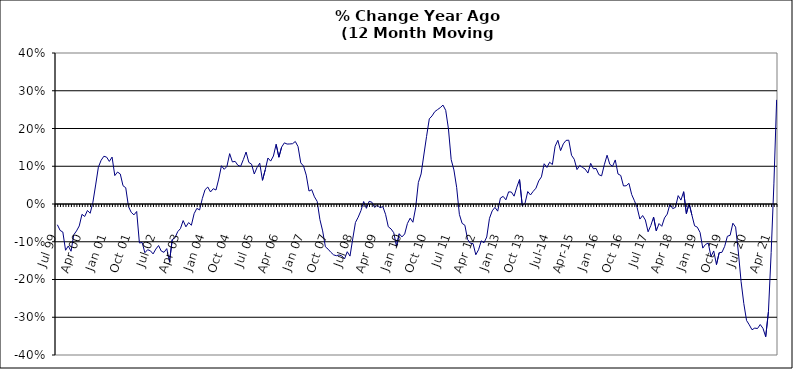
| Category | Series 0 |
|---|---|
| Jul 99 | -0.055 |
| Aug 99 | -0.07 |
| Sep 99 | -0.074 |
| Oct 99 | -0.123 |
| Nov 99 | -0.111 |
| Dec 99 | -0.125 |
| Jan 00 | -0.082 |
| Feb 00 | -0.071 |
| Mar 00 | -0.058 |
| Apr 00 | -0.027 |
| May 00 | -0.033 |
| Jun 00 | -0.017 |
| Jul 00 | -0.025 |
| Aug 00 | 0.005 |
| Sep 00 | 0.05 |
| Oct 00 | 0.098 |
| Nov 00 | 0.116 |
| Dec 00 | 0.127 |
| Jan 01 | 0.124 |
| Feb 01 | 0.113 |
| Mar 01 | 0.124 |
| Apr 01 | 0.075 |
| May 01 | 0.085 |
| Jun 01 | 0.08 |
| Jul 01 | 0.048 |
| Aug 01 | 0.043 |
| Sep 01 | -0.007 |
| Oct 01 | -0.022 |
| Nov 01 | -0.029 |
| Dec 01 | -0.02 |
| Jan 02 | -0.103 |
| Feb 02 | -0.102 |
| Mar 02 | -0.129 |
| Apr 02 | -0.121 |
| May 02 | -0.124 |
| Jun 02 | -0.132 |
| Jul 02 | -0.119 |
| Aug 02 | -0.11 |
| Sep 02 | -0.125 |
| Oct 02 | -0.128 |
| Nov 02 | -0.118 |
| Dec 02 | -0.153 |
| Jan 03 | -0.094 |
| Feb 03 | -0.09 |
| Mar 03 | -0.073 |
| Apr 03 | -0.065 |
| May 03 | -0.044 |
| Jun 03 | -0.06 |
| Jul 03 | -0.049 |
| Aug 03 | -0.056 |
| Sep 03 | -0.026 |
| Oct 03 | -0.012 |
| Nov 03 | -0.016 |
| Dec 03 | 0.014 |
| Jan 04 | 0.038 |
| Feb 04 | 0.045 |
| Mar 04 | 0.032 |
| Apr 04 | 0.041 |
| May 04 | 0.037 |
| Jun 04 | 0.066 |
| Jul 04 | 0.101 |
| Aug 04 | 0.092 |
| Sep 04 | 0.1 |
| Oct 04 | 0.133 |
| Nov 04 | 0.111 |
| Dec 04 | 0.113 |
| Jan 05 | 0.103 |
| Feb 05 | 0.1 |
| Mar 05 | 0.118 |
| Apr 05 | 0.138 |
| May 05 | 0.11 |
| Jun 05 | 0.106 |
| Jul 05 | 0.079 |
| Aug 05 | 0.097 |
| Sep 05 | 0.108 |
| Oct 05 | 0.063 |
| Nov 05 | 0.09 |
| Dec 05 | 0.122 |
| Jan 06 | 0.114 |
| Feb 06 | 0.127 |
| Mar 06 | 0.158 |
| Apr 06 | 0.124 |
| May 06 | 0.151 |
| Jun 06 | 0.162 |
| Jul 06 | 0.159 |
| Aug 06 | 0.159 |
| Sep 06 | 0.16 |
| Oct 06 | 0.166 |
| Nov 06 | 0.152 |
| Dec 06 | 0.109 |
| Jan 07 | 0.101 |
| Feb 07 | 0.076 |
| Mar 07 | 0.034 |
| Apr 07 | 0.038 |
| May 07 | 0.019 |
| Jun 07 | 0.007 |
| Jul 07 | -0.041 |
| Aug 07 | -0.071 |
| Sep 07 | -0.113 |
| Oct 07 | -0.12 |
| Nov 07 | -0.128 |
| Dec 07 | -0.135 |
| Jan 08 | -0.137 |
| Feb 08 | -0.135 |
| Mar 08 | -0.137 |
| Apr 08 | -0.145 |
| May 08 | -0.126 |
| Jun 08 | -0.138 |
| Jul 08 | -0.093 |
| Aug 08 | -0.049 |
| Sep-08 | -0.035 |
| Oct 08 | -0.018 |
| Nov 08 | 0.007 |
| Dec 08 | -0.011 |
| Jan 09 | 0.007 |
| Feb 09 | 0.005 |
| Mar 09 | -0.009 |
| Apr 09 | -0.003 |
| May 09 | -0.01 |
| Jun 09 | -0.007 |
| Jul 09 | -0.027 |
| Aug 09 | -0.06 |
| Sep 09 | -0.066 |
| Oct 09 | -0.076 |
| Nov 09 | -0.112 |
| Dec 09 | -0.079 |
| Jan 10 | -0.087 |
| Feb 10 | -0.079 |
| Mar 10 | -0.052 |
| Apr 10 | -0.037 |
| May 10 | -0.048 |
| Jun 10 | -0.01 |
| Jul 10 | 0.057 |
| Aug 10 | 0.08 |
| Sep 10 | 0.13 |
| Oct 10 | 0.179 |
| Nov 10 | 0.226 |
| Dec 10 | 0.233 |
| Jan 11 | 0.245 |
| Feb 11 | 0.25 |
| Mar 11 | 0.255 |
| Apr 11 | 0.262 |
| May 11 | 0.248 |
| Jun 11 | 0.199 |
| Jul 11 | 0.118 |
| Aug 11 | 0.09 |
| Sep 11 | 0.044 |
| Oct 11 | -0.028 |
| Nov 11 | -0.051 |
| Dec 11 | -0.056 |
| Jan 12 | -0.094 |
| Feb 12 | -0.104 |
| Mar 12 | -0.105 |
| Apr 12 | -0.134 |
| May 12 | -0.121 |
| Jun 12 | -0.098 |
| Jul 12 | -0.103 |
| Aug 12 | -0.087 |
| Sep 12 | -0.038 |
| Oct 12 | -0.018 |
| Nov 12 | -0.009 |
| Dec 12 | -0.019 |
| Jan 13 | 0.016 |
| Feb-13 | 0.02 |
| Mar-13 | 0.011 |
| Apr 13 | 0.032 |
| May 13 | 0.032 |
| Jun-13 | 0.021 |
| Jul 13 | 0.045 |
| Aug 13 | 0.065 |
| Sep 13 | -0.005 |
| Oct 13 | 0.002 |
| Nov 13 | 0.033 |
| Dec 13 | 0.024 |
| Jan 14 | 0.034 |
| Feb-14 | 0.042 |
| Mar 14 | 0.061 |
| Apr 14 | 0.072 |
| May 14 | 0.107 |
| Jun 14 | 0.097 |
| Jul-14 | 0.111 |
| Aug-14 | 0.105 |
| Sep 14 | 0.153 |
| Oct 14 | 0.169 |
| Nov 14 | 0.141 |
| Dec 14 | 0.159 |
| Jan 15 | 0.169 |
| Feb 15 | 0.169 |
| Mar 15 | 0.129 |
| Apr-15 | 0.118 |
| May 15 | 0.091 |
| Jun-15 | 0.102 |
| Jul 15 | 0.097 |
| Aug 15 | 0.092 |
| Sep 15 | 0.082 |
| Oct 15 | 0.108 |
| Nov 15 | 0.093 |
| Dec 15 | 0.094 |
| Jan 16 | 0.078 |
| Feb 16 | 0.075 |
| Mar 16 | 0.104 |
| Apr 16 | 0.129 |
| May 16 | 0.105 |
| Jun 16 | 0.1 |
| Jul 16 | 0.117 |
| Aug 16 | 0.08 |
| Sep 16 | 0.076 |
| Oct 16 | 0.048 |
| Nov 16 | 0.048 |
| Dec 16 | 0.055 |
| Jan 17 | 0.025 |
| Feb 17 | 0.009 |
| Mar 17 | -0.01 |
| Apr 17 | -0.04 |
| May 17 | -0.031 |
| Jun 17 | -0.042 |
| Jul 17 | -0.074 |
| Aug 17 | -0.057 |
| Sep 17 | -0.035 |
| Oct 17 | -0.071 |
| Nov 17 | -0.052 |
| Dec 17 | -0.059 |
| Jan 18 | -0.037 |
| Feb 18 | -0.027 |
| Mar 18 | 0 |
| Apr 18 | -0.012 |
| May 18 | -0.009 |
| Jun 18 | 0.022 |
| Jul 18 | 0.01 |
| Aug 18 | 0.033 |
| Sep 18 | -0.025 |
| Oct 18 | 0.002 |
| Nov 18 | -0.029 |
| Dec 18 | -0.058 |
| Jan 19 | -0.061 |
| Feb 19 | -0.075 |
| Mar 19 | -0.117 |
| Apr 19 | -0.107 |
| May 19 | -0.104 |
| Jun 19 | -0.139 |
| Jul 19 | -0.124 |
| Aug 19 | -0.16 |
| Sep 19 | -0.129 |
| Oct 19 | -0.128 |
| Nov 19 | -0.112 |
| Dec 19 | -0.085 |
| Jan 20 | -0.083 |
| Feb 20 | -0.051 |
| Mar 20 | -0.061 |
| Apr 20 | -0.127 |
| May 20 | -0.206 |
| Jun 20 | -0.264 |
| Jul 20 | -0.308 |
| Aug 20 | -0.32 |
| Sep 20 | -0.333 |
| Oct 20 | -0.329 |
| Nov 20 | -0.33 |
| Dec 20 | -0.319 |
| Jan 21 | -0.329 |
| Feb 21 | -0.352 |
| Mar 21 | -0.286 |
| Apr 21 | -0.129 |
| May 21 | 0.053 |
| Jun 21 | 0.276 |